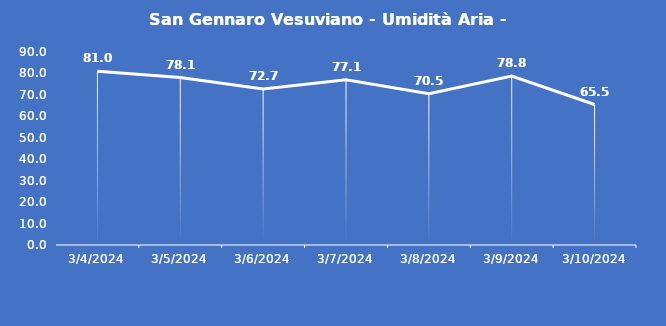
| Category | San Gennaro Vesuviano - Umidità Aria - Grezzo (%) |
|---|---|
| 3/4/24 | 81 |
| 3/5/24 | 78.1 |
| 3/6/24 | 72.7 |
| 3/7/24 | 77.1 |
| 3/8/24 | 70.5 |
| 3/9/24 | 78.8 |
| 3/10/24 | 65.5 |